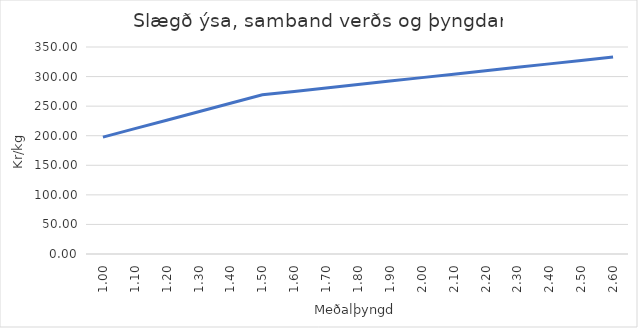
| Category | 182,19 |
|---|---|
| 1.0 | 197.619 |
| 1.1 | 211.922 |
| 1.2 | 226.224 |
| 1.3 | 240.526 |
| 1.4 | 254.829 |
| 1.5 | 269.131 |
| 1.6 | 274.947 |
| 1.7 | 280.763 |
| 1.8 | 286.579 |
| 1.9 | 292.396 |
| 2.0 | 298.212 |
| 2.1 | 304.028 |
| 2.2 | 309.844 |
| 2.3 | 315.661 |
| 2.4 | 321.477 |
| 2.5 | 327.293 |
| 2.6 | 333.109 |